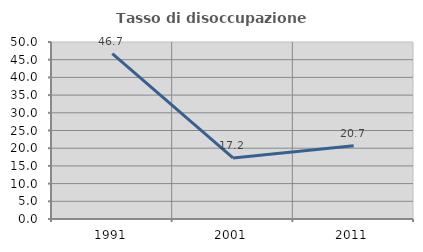
| Category | Tasso di disoccupazione giovanile  |
|---|---|
| 1991.0 | 46.729 |
| 2001.0 | 17.241 |
| 2011.0 | 20.69 |